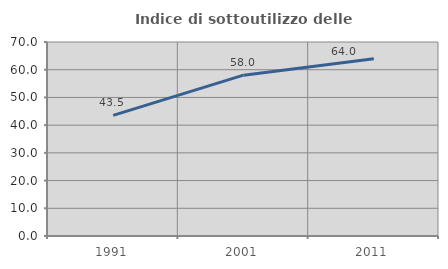
| Category | Indice di sottoutilizzo delle abitazioni  |
|---|---|
| 1991.0 | 43.506 |
| 2001.0 | 58.036 |
| 2011.0 | 63.953 |